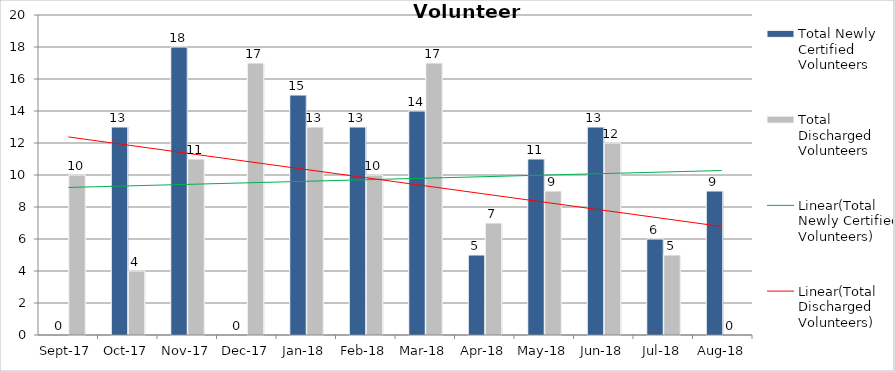
| Category | Total Newly Certified Volunteers | Total Discharged Volunteers |
|---|---|---|
| 2017-09-01 | 0 | 10 |
| 2017-10-01 | 13 | 4 |
| 2017-11-01 | 18 | 11 |
| 2017-12-01 | 0 | 17 |
| 2018-01-01 | 15 | 13 |
| 2018-02-01 | 13 | 10 |
| 2018-03-01 | 14 | 17 |
| 2018-04-01 | 5 | 7 |
| 2018-05-01 | 11 | 9 |
| 2018-06-01 | 13 | 12 |
| 2018-07-01 | 6 | 5 |
| 2018-08-01 | 9 | 0 |